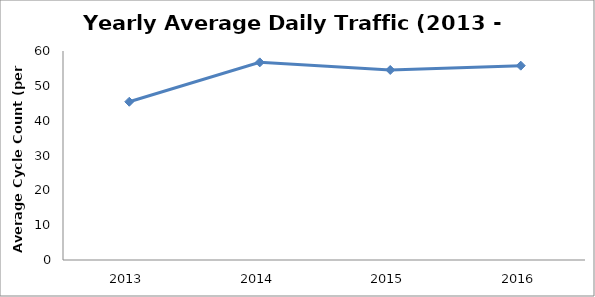
| Category | Series 0 |
|---|---|
| 2013.0 | 45.43 |
| 2014.0 | 56.737 |
| 2015.0 | 54.551 |
| 2016.0 | 55.787 |